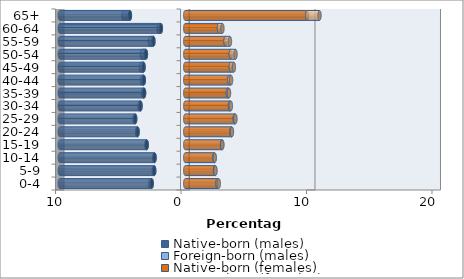
| Category | Native-born (males) | Foreign-born (males) | Native-born (females) | Foreign-born (females) |
|---|---|---|---|---|
| 0-4 | -2.673 | -0.116 | 2.563 | 0.105 |
| 5-9 | -2.474 | -0.032 | 2.374 | 0.03 |
| 10-14 | -2.448 | -0.017 | 2.327 | 0.016 |
| 15-19 | -3.073 | -0.021 | 2.933 | 0.021 |
| 20-24 | -3.799 | -0.037 | 3.682 | 0.035 |
| 25-29 | -3.99 | -0.061 | 3.939 | 0.06 |
| 30-34 | -3.566 | -0.073 | 3.56 | 0.076 |
| 35-39 | -3.281 | -0.088 | 3.392 | 0.096 |
| 40-44 | -3.302 | -0.133 | 3.504 | 0.147 |
| 45-49 | -3.324 | -0.214 | 3.631 | 0.243 |
| 50-54 | -3.135 | -0.32 | 3.629 | 0.375 |
| 55-59 | -2.538 | -0.28 | 3.208 | 0.353 |
| 60-64 | -1.943 | -0.181 | 2.685 | 0.276 |
| 65+ | -4.41 | -0.512 | 9.717 | 0.982 |